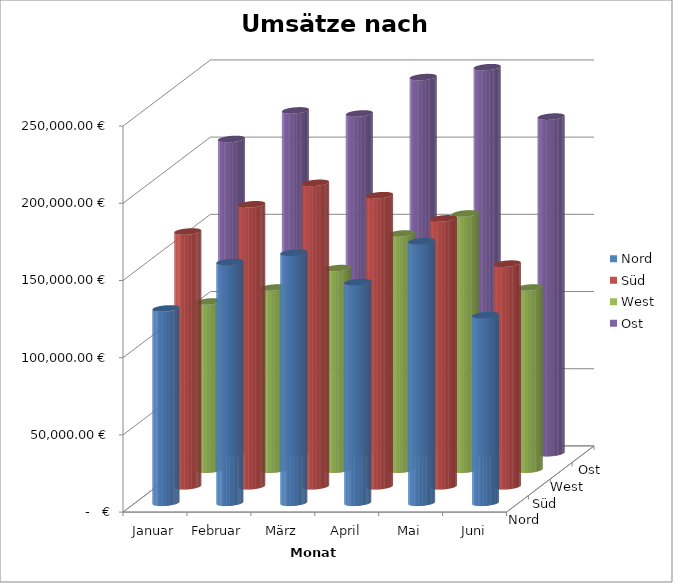
| Category | Nord | Süd | West | Ost |
|---|---|---|---|---|
| Januar | 125890 | 165000 | 109000 | 203500 |
| Februar | 156000 | 182632 | 118000 | 222000 |
| März | 162000 | 196523 | 130600 | 220000 |
| April | 143000 | 188523 | 153000 | 243580 |
| Mai | 169500 | 173500 | 166000 | 250000 |
| Juni | 121580 | 144200 | 118000 | 218000 |